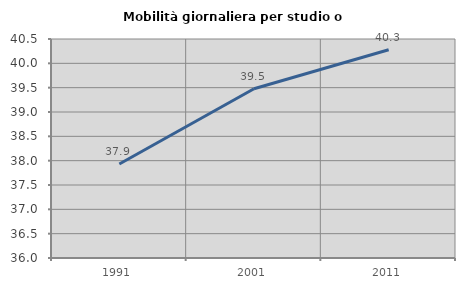
| Category | Mobilità giornaliera per studio o lavoro |
|---|---|
| 1991.0 | 37.931 |
| 2001.0 | 39.478 |
| 2011.0 | 40.28 |